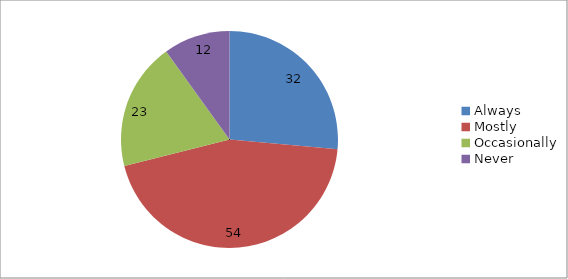
| Category | Series 0 |
|---|---|
| Always | 32 |
| Mostly | 54 |
| Occasionally | 23 |
| Never | 12 |